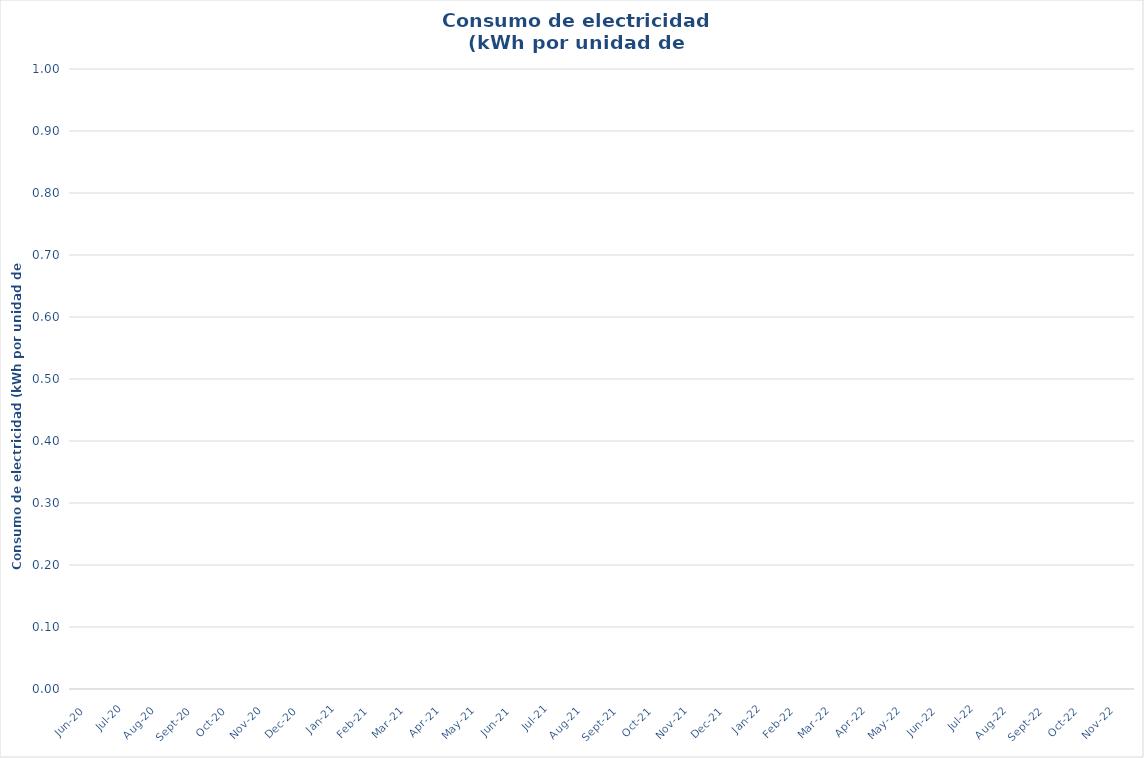
| Category | Series 0 |
|---|---|
| 2020-06-01 | 0 |
| 2020-07-01 | 0 |
| 2020-08-01 | 0 |
| 2020-09-01 | 0 |
| 2020-10-01 | 0 |
| 2020-11-01 | 0 |
| 2020-12-01 | 0 |
| 2021-01-01 | 0 |
| 2021-02-01 | 0 |
| 2021-03-01 | 0 |
| 2021-04-01 | 0 |
| 2021-05-01 | 0 |
| 2021-06-01 | 0 |
| 2021-07-01 | 0 |
| 2021-08-01 | 0 |
| 2021-09-01 | 0 |
| 2021-10-01 | 0 |
| 2021-11-01 | 0 |
| 2021-12-01 | 0 |
| 2022-01-01 | 0 |
| 2022-02-01 | 0 |
| 2022-03-01 | 0 |
| 2022-04-01 | 0 |
| 2022-05-01 | 0 |
| 2022-06-01 | 0 |
| 2022-07-01 | 0 |
| 2022-08-01 | 0 |
| 2022-09-01 | 0 |
| 2022-10-01 | 0 |
| 2022-11-01 | 0 |